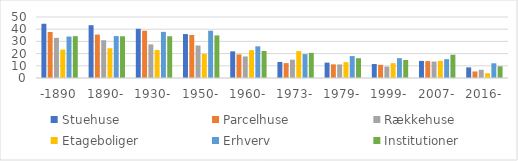
| Category | Stuehuse | Parcelhuse | Rækkehuse | Etageboliger | Erhverv | Institutioner |
|---|---|---|---|---|---|---|
| -1890 | 44.461 | 37.694 | 32.897 | 23.252 | 33.967 | 34.31 |
| 1890- | 43.265 | 35.617 | 30.956 | 24.398 | 34.356 | 34.216 |
| 1930- | 40.347 | 38.747 | 27.532 | 22.928 | 37.829 | 34.215 |
| 1950- | 36.023 | 35.251 | 26.609 | 19.743 | 38.767 | 34.909 |
| 1960- | 21.821 | 19.371 | 17.659 | 22.841 | 25.956 | 22.145 |
| 1973- | 13.157 | 12.214 | 14.983 | 22.082 | 19.568 | 20.597 |
| 1979- | 12.593 | 11.179 | 11.11 | 12.977 | 17.977 | 16.219 |
| 1999- | 11.451 | 10.821 | 9.366 | 12.146 | 16.271 | 14.734 |
| 2007- | 14.009 | 13.848 | 13.468 | 14.05 | 15.44 | 19.049 |
| 2016- | 8.695 | 5.364 | 6.765 | 3.924 | 12.06 | 9.605 |